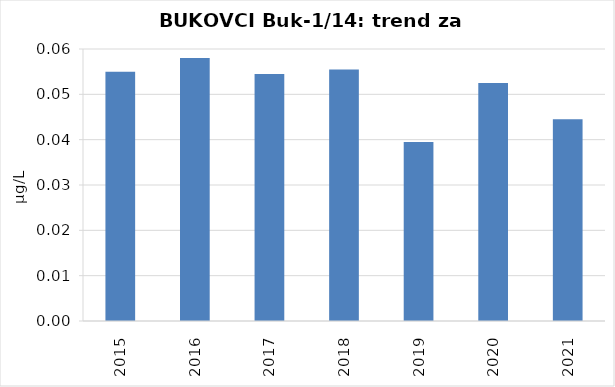
| Category | Vsota |
|---|---|
| 2015 | 0.055 |
| 2016 | 0.058 |
| 2017 | 0.054 |
| 2018 | 0.056 |
| 2019 | 0.04 |
| 2020 | 0.052 |
| 2021 | 0.044 |